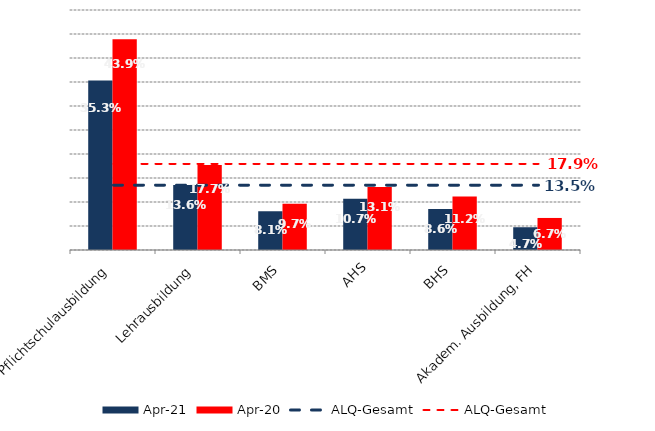
| Category | Apr 21 | Apr 20 |
|---|---|---|
| Pflichtschulausbildung | 0.353 | 0.439 |
| Lehrausbildung | 0.136 | 0.177 |
| BMS | 0.081 | 0.097 |
| AHS | 0.107 | 0.131 |
| BHS | 0.086 | 0.112 |
| Akadem. Ausbildung, FH | 0.047 | 0.067 |